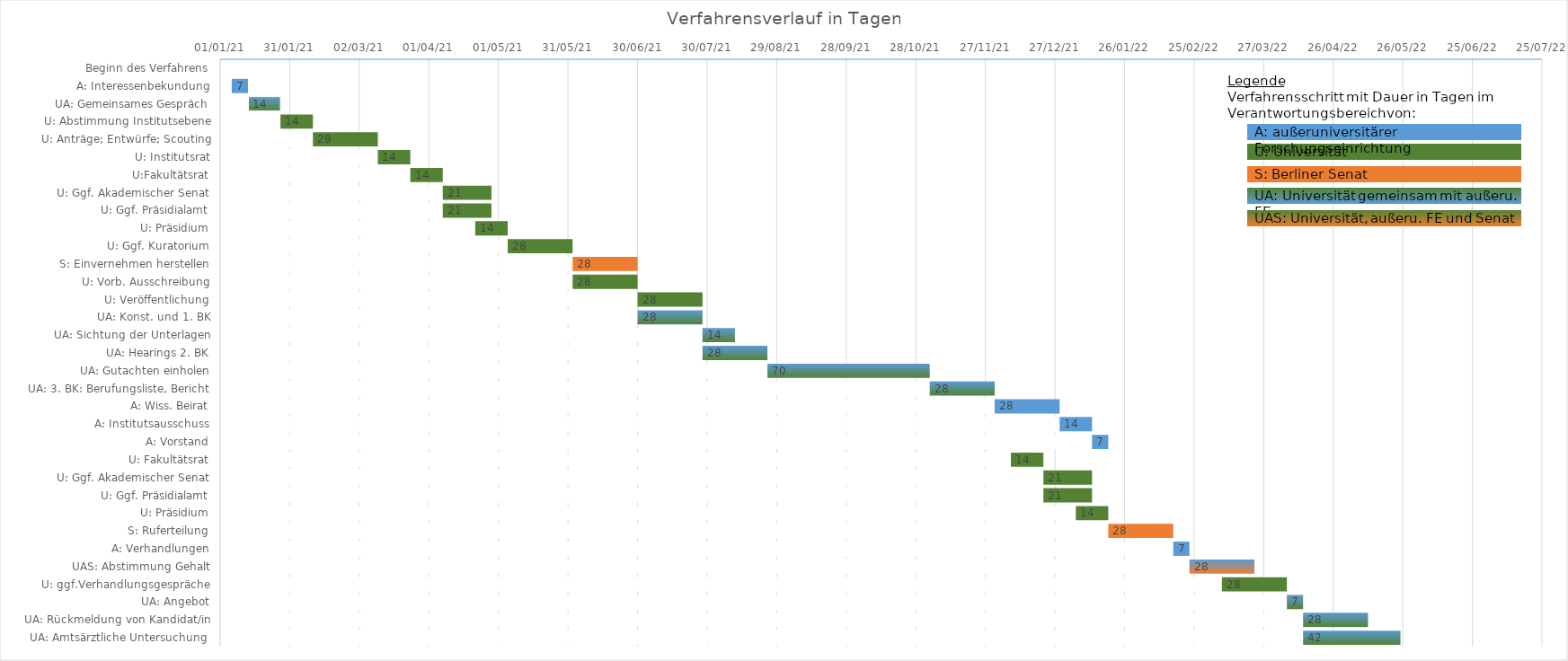
| Category | Start | Duration |
|---|---|---|
| Beginn des Verfahrens | 1/6/21 | 0 |
| A: Interessenbekundung | 1/6/21 | 7 |
| UA: Gemeinsames Gespräch | 1/13/21 | 14 |
| U: Abstimmung Institutsebene | 1/27/21 | 14 |
| U: Anträge; Entwürfe; Scouting | 2/10/21 | 28 |
| U: Institutsrat | 3/10/21 | 14 |
| U:Fakultätsrat | 3/24/21 | 14 |
| U: Ggf. Akademischer Senat | 4/7/21 | 21 |
| U: Ggf. Präsidialamt | 4/7/21 | 21 |
| U: Präsidium | 4/21/21 | 14 |
| U: Ggf. Kuratorium | 5/5/21 | 28 |
| S: Einvernehmen herstellen | 6/2/21 | 28 |
| U: Vorb. Ausschreibung | 6/2/21 | 28 |
| U: Veröffentlichung | 6/30/21 | 28 |
| UA: Konst. und 1. BK | 6/30/21 | 28 |
| UA: Sichtung der Unterlagen | 7/28/21 | 14 |
| UA: Hearings 2. BK | 7/28/21 | 28 |
| UA: Gutachten einholen | 8/25/21 | 70 |
| UA: 3. BK: Berufungsliste, Bericht | 11/3/21 | 28 |
| A: Wiss. Beirat | 12/1/21 | 28 |
| A: Institutsausschuss | 12/29/21 | 14 |
| A: Vorstand | 1/12/22 | 7 |
| U: Fakultätsrat | 12/8/21 | 14 |
| U: Ggf. Akademischer Senat | 12/22/21 | 21 |
| U: Ggf. Präsidialamt | 12/22/21 | 21 |
| U: Präsidium | 1/5/22 | 14 |
| S: Ruferteilung | 1/19/22 | 28 |
| A: Verhandlungen | 2/16/22 | 7 |
| UAS: Abstimmung Gehalt | 2/23/22 | 28 |
| U: ggf.Verhandlungsgespräche | 3/9/22 | 28 |
| UA: Angebot | 4/6/22 | 7 |
| UA: Rückmeldung von Kandidat/in | 4/13/22 | 28 |
| UA: Amtsärztliche Untersuchung  | 4/13/22 | 42 |